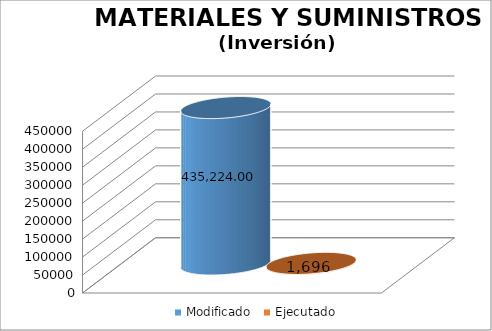
| Category | Modificado | Ejecutado |
|---|---|---|
| 0 | 435224 | 1696.32 |